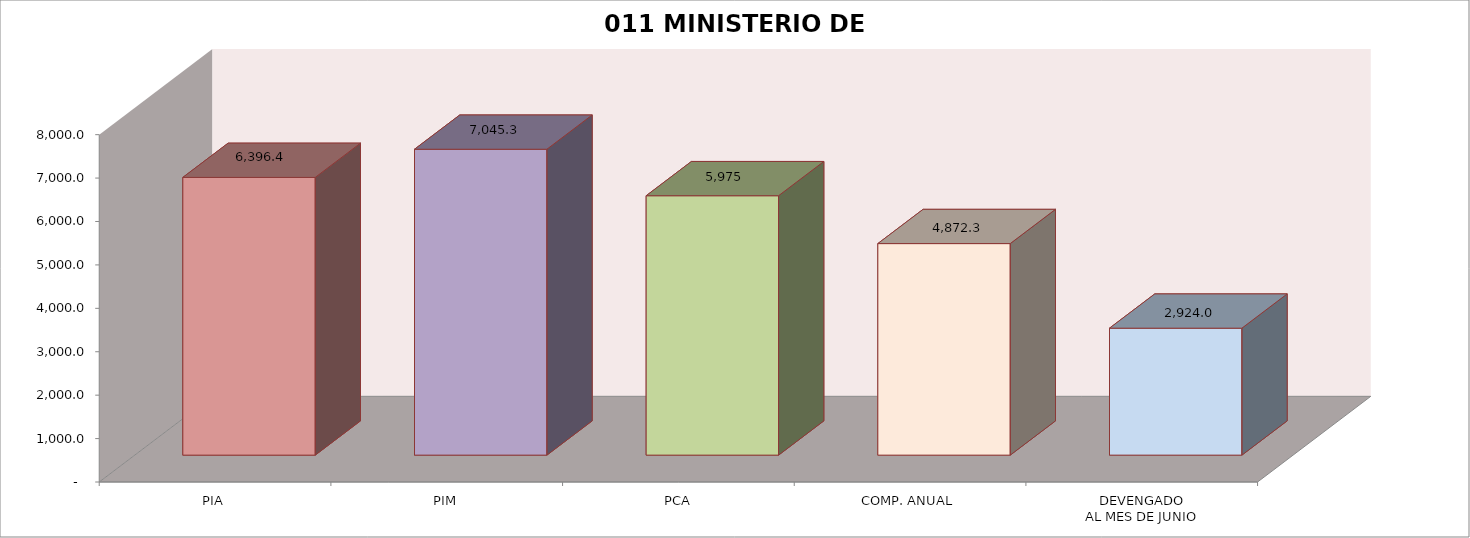
| Category | 011 MINISTERIO DE SALUD |
|---|---|
| PIA | 6396.414 |
| PIM | 7045.302 |
| PCA | 5974.646 |
| COMP. ANUAL | 4872.27 |
| DEVENGADO
AL MES DE JUNIO | 2923.994 |